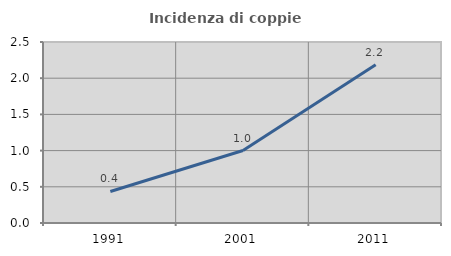
| Category | Incidenza di coppie miste |
|---|---|
| 1991.0 | 0.435 |
| 2001.0 | 1.001 |
| 2011.0 | 2.186 |